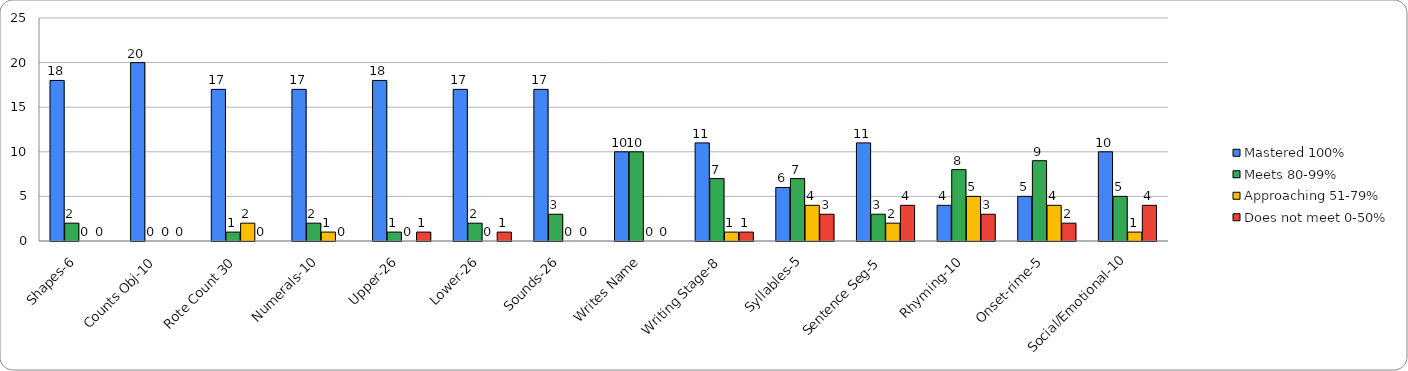
| Category | Mastered 100% | Meets 80-99% | Approaching 51-79% | Does not meet 0-50% |
|---|---|---|---|---|
| Shapes-6 | 18 | 2 | 0 | 0 |
| Counts Obj-10 | 20 | 0 | 0 | 0 |
| Rote Count 30 | 17 | 1 | 2 | 0 |
| Numerals-10 | 17 | 2 | 1 | 0 |
| Upper-26 | 18 | 1 | 0 | 1 |
| Lower-26 | 17 | 2 | 0 | 1 |
| Sounds-26 | 17 | 3 | 0 | 0 |
| Writes Name | 10 | 10 | 0 | 0 |
| Writing Stage-8 | 11 | 7 | 1 | 1 |
| Syllables-5 | 6 | 7 | 4 | 3 |
| Sentence Seg-5 | 11 | 3 | 2 | 4 |
| Rhyming-10 | 4 | 8 | 5 | 3 |
| Onset-rime-5 | 5 | 9 | 4 | 2 |
| Social/Emotional-10 | 10 | 5 | 1 | 4 |